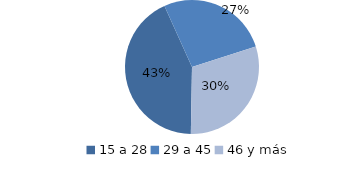
| Category | Series 0 |
|---|---|
| 15 a 28 | 225.245 |
| 29 a 45 | 140.564 |
| 46 y más | 158.249 |